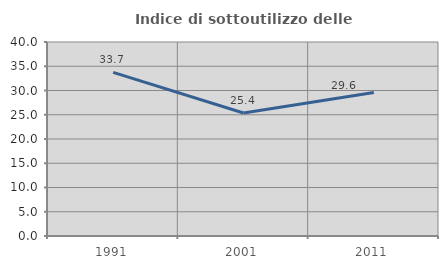
| Category | Indice di sottoutilizzo delle abitazioni  |
|---|---|
| 1991.0 | 33.725 |
| 2001.0 | 25.352 |
| 2011.0 | 29.605 |